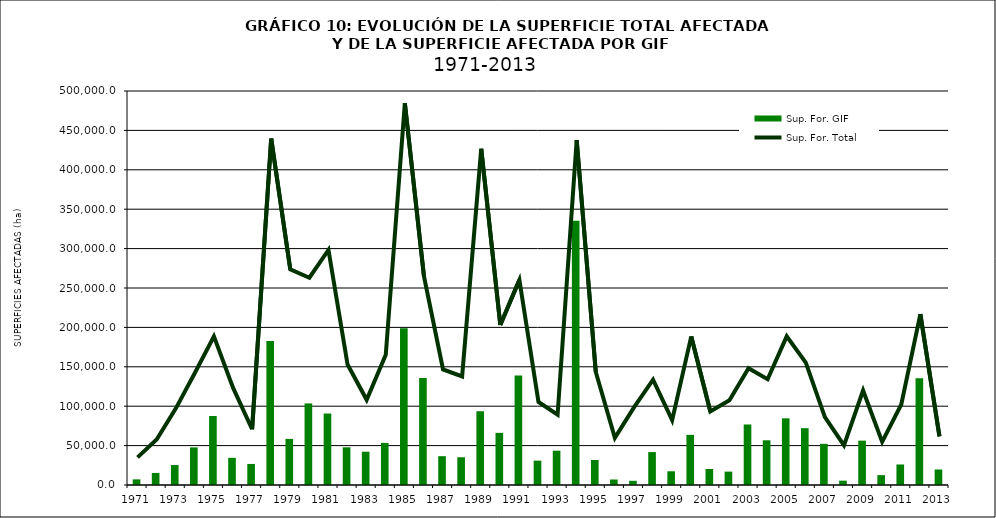
| Category | Sup. For. GIF |
|---|---|
| 1971.0 | 7138 |
| 1972.0 | 15303 |
| 1973.0 | 25341.9 |
| 1974.0 | 47718 |
| 1975.0 | 87535 |
| 1976.0 | 34450 |
| 1977.0 | 26717.5 |
| 1978.0 | 182614.8 |
| 1979.0 | 58497.2 |
| 1980.0 | 103550 |
| 1981.0 | 90711 |
| 1982.0 | 47821.7 |
| 1983.0 | 42239.3 |
| 1984.0 | 53410.7 |
| 1985.0 | 198994.8 |
| 1986.0 | 135756 |
| 1987.0 | 36562.9 |
| 1988.0 | 35205 |
| 1989.0 | 93592.6 |
| 1990.0 | 66183.8 |
| 1991.0 | 138928.1 |
| 1992.0 | 30918.6 |
| 1993.0 | 43532.3 |
| 1994.0 | 335359.2 |
| 1995.0 | 31699.8 |
| 1996.0 | 6962.4 |
| 1997.0 | 5309.4 |
| 1998.0 | 41761.62 |
| 1999.0 | 17399.05 |
| 2000.0 | 63634.69 |
| 2001.0 | 20325.2 |
| 2002.0 | 16993.35 |
| 2003.0 | 76796.21 |
| 2004.0 | 56725.8 |
| 2005.0 | 84605.76 |
| 2006.0 | 72119.08 |
| 2007.0 | 52233.72 |
| 2008.0 | 5499.74 |
| 2009.0 | 56266.49 |
| 2010.0 | 12538.79 |
| 2011.0 | 26034.47 |
| 2013.0 | 135579.9 |
| 2013.0 | 19690.12 |